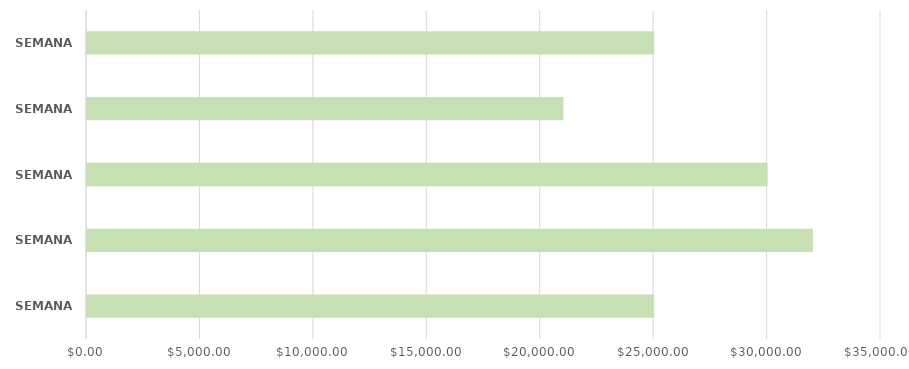
| Category | Series 0 |
|---|---|
| SEMANA 1 | 25000 |
| SEMANA 2 | 32000 |
| SEMANA 3 | 30000 |
| SEMANA 4 | 21000 |
| SEMANA 5 | 25000 |